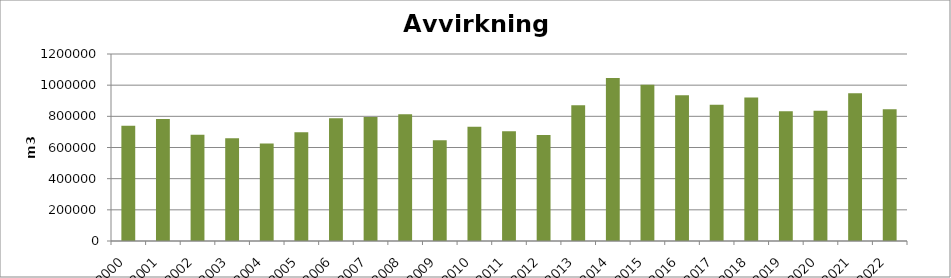
| Category | Totalt |
|---|---|
| 2000 | 739147 |
| 2001 | 782342 |
| 2002 | 682469 |
| 2003 | 659451 |
| 2004 | 625293 |
| 2005 | 698431 |
| 2006 | 787030 |
| 2007 | 795331 |
| 2008 | 813775 |
| 2009 | 646315 |
| 2010 | 733304 |
| 2011 | 704386 |
| 2012 | 680065 |
| 2013 | 870516 |
| 2014 | 1046122 |
| 2015 | 1003383 |
| 2016 | 934795 |
| 2017 | 873623 |
| 2018 | 920743 |
| 2019 | 832367 |
| 2020 | 836616 |
| 2021 | 948718 |
| 2022 | 845313 |